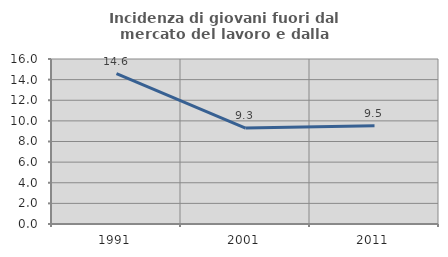
| Category | Incidenza di giovani fuori dal mercato del lavoro e dalla formazione  |
|---|---|
| 1991.0 | 14.591 |
| 2001.0 | 9.306 |
| 2011.0 | 9.516 |